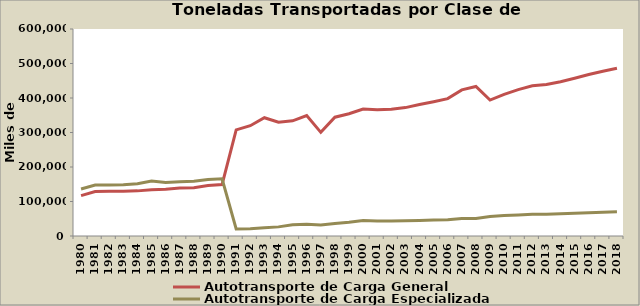
| Category | Autotransporte de Carga General | Autotransporte de Carga Especializada |
|---|---|---|
| 1980.0 | 117023 | 136146 |
| 1981.0 | 128754 | 147538 |
| 1982.0 | 129354 | 147999 |
| 1983.0 | 129714 | 148368 |
| 1984.0 | 130806 | 151377 |
| 1985.0 | 134112 | 159297 |
| 1986.0 | 135595 | 154964 |
| 1987.0 | 138810 | 157278 |
| 1988.0 | 140134 | 158736 |
| 1989.0 | 146292 | 163511 |
| 1990.0 | 149009 | 165666 |
| 1991.0 | 307444 | 20329 |
| 1992.0 | 319742 | 21318 |
| 1993.0 | 342871 | 23757 |
| 1994.0 | 330053 | 26434 |
| 1995.0 | 333800 | 32873 |
| 1996.0 | 349142 | 34125 |
| 1997.0 | 300444 | 32022 |
| 1998.0 | 344282 | 36519 |
| 1999.0 | 354241 | 40191 |
| 2000.0 | 368066 | 45127 |
| 2001.0 | 365912 | 43298 |
| 2002.0 | 367600 | 43500 |
| 2003.0 | 372150 | 44050 |
| 2004.0 | 381000 | 45100 |
| 2005.0 | 389400 | 46100 |
| 2006.0 | 398158 | 47291 |
| 2007.0 | 423458.767 | 50401.095 |
| 2008.0 | 433400 | 50900 |
| 2009.0 | 394079 | 56821 |
| 2010.0 | 410772 | 59228 |
| 2011.0 | 424321 | 61181 |
| 2012.0 | 435373 | 62774 |
| 2013.0 | 438871 | 63279 |
| 2014.0 | 446903 | 64437 |
| 2015.0 | 457085 | 65905 |
| 2016.0 | 468060 | 67488 |
| 2017.0 | 477709 | 68879 |
| 2018.0 | 486296 | 70115 |